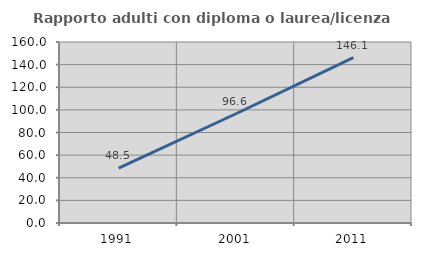
| Category | Rapporto adulti con diploma o laurea/licenza media  |
|---|---|
| 1991.0 | 48.549 |
| 2001.0 | 96.567 |
| 2011.0 | 146.137 |